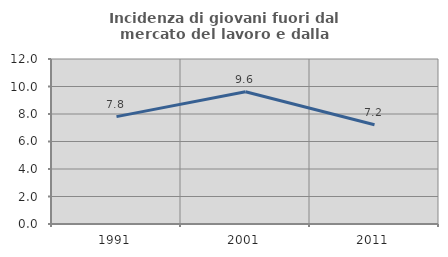
| Category | Incidenza di giovani fuori dal mercato del lavoro e dalla formazione  |
|---|---|
| 1991.0 | 7.81 |
| 2001.0 | 9.615 |
| 2011.0 | 7.223 |